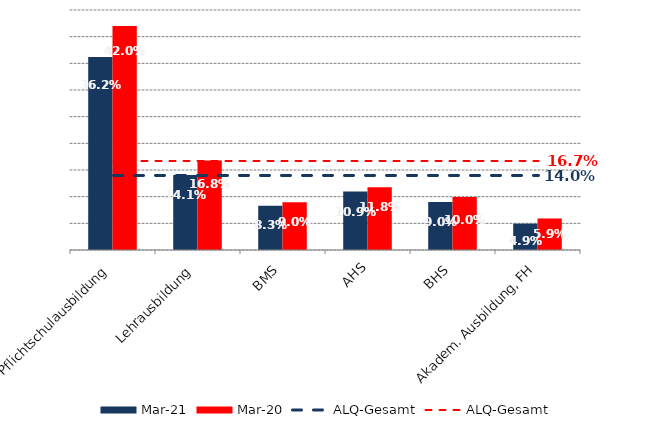
| Category | Mrz 21 | Mrz 20 |
|---|---|---|
| Pflichtschulausbildung | 0.362 | 0.42 |
| Lehrausbildung | 0.141 | 0.168 |
| BMS | 0.083 | 0.09 |
| AHS | 0.109 | 0.118 |
| BHS | 0.09 | 0.1 |
| Akadem. Ausbildung, FH | 0.049 | 0.059 |